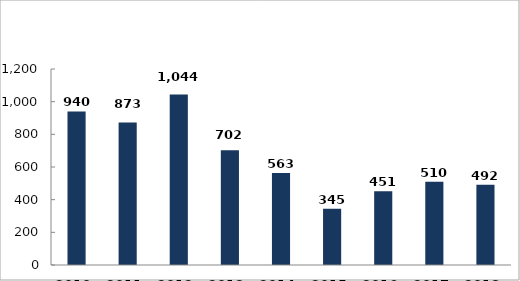
| Category | Pozitív eredményű alkoholszonda alkalmazások száma (eset) |
|---|---|
| 2010. év | 940 |
| 2011. év | 873 |
| 2012. év | 1044 |
| 2013. év | 702 |
| 2014. év | 563 |
| 2015. év | 345 |
| 2016. év | 451 |
| 2017. év | 510 |
| 2018. év | 492 |